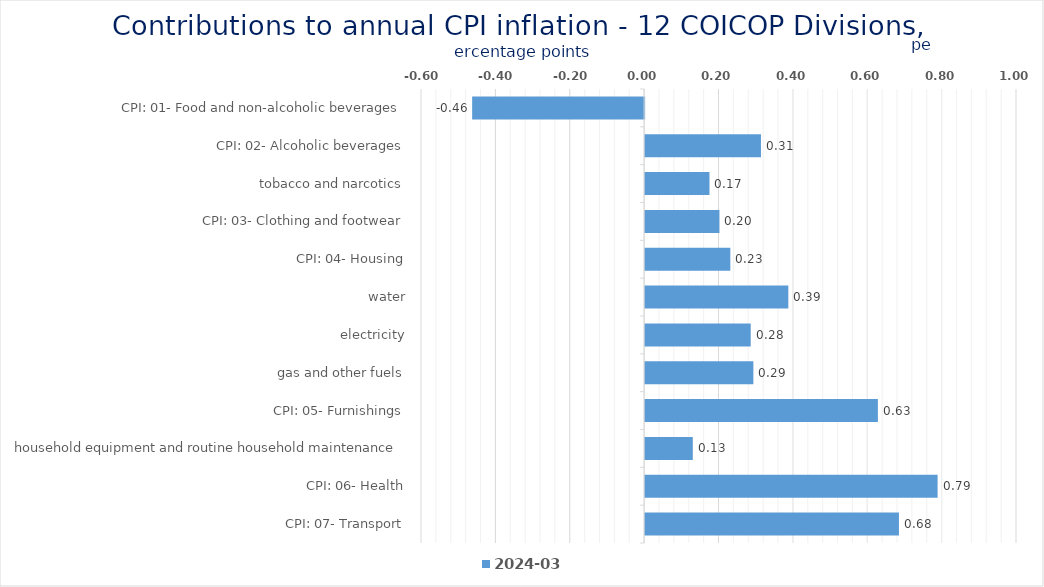
| Category | 2024-03 |
|---|---|
| CPI: 01- Food and non-alcoholic beverages | -0.462 |
| CPI: 02- Alcoholic beverages, tobacco and narcotics | 0.311 |
| CPI: 03- Clothing and footwear | 0.173 |
| CPI: 04- Housing, water, electricity, gas and other fuels | 0.2 |
| CPI: 05- Furnishings, household equipment and routine household maintenance | 0.229 |
| CPI: 06- Health | 0.385 |
| CPI: 07- Transport | 0.284 |
| CPI: 08- Communication | 0.291 |
| CPI: 09- Recreation and culture | 0.626 |
| CPI: 10- Education | 0.128 |
| CPI: 11- Restaurants and hotels | 0.786 |
| CPI: 12- Miscellaneous goods and services | 0.683 |